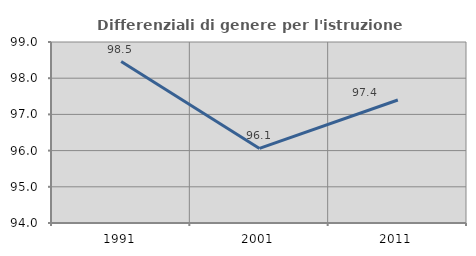
| Category | Differenziali di genere per l'istruzione superiore |
|---|---|
| 1991.0 | 98.459 |
| 2001.0 | 96.06 |
| 2011.0 | 97.399 |